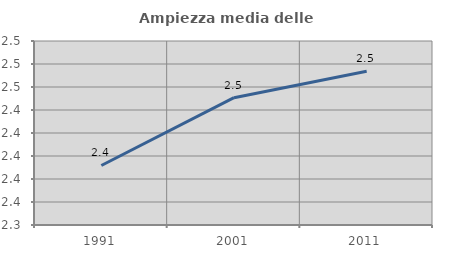
| Category | Ampiezza media delle famiglie |
|---|---|
| 1991.0 | 2.392 |
| 2001.0 | 2.451 |
| 2011.0 | 2.474 |